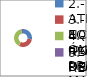
| Category | Series 0 |
|---|---|
| 2.- ATENCIÓN PRIMARIA DE
LA RED | 9 |
| 3.- EQUIPO DE APOYO TÉCNICO PERSONAL Y FAMILIAR PARA LA INCLUSIÓN SOCIAL | 10 |
| 4.- RECURSO PARA EL EMPLEO | 13 |
| 5.- RECURSO DE ALOJAMIENTO PARA LA INCLUSIÓN | 1 |